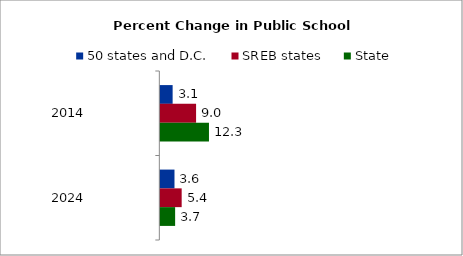
| Category | 50 states and D.C. | SREB states | State |
|---|---|---|---|
| 2014.0 | 3.109 | 9.037 | 12.295 |
| 2024.0 | 3.578 | 5.394 | 3.741 |